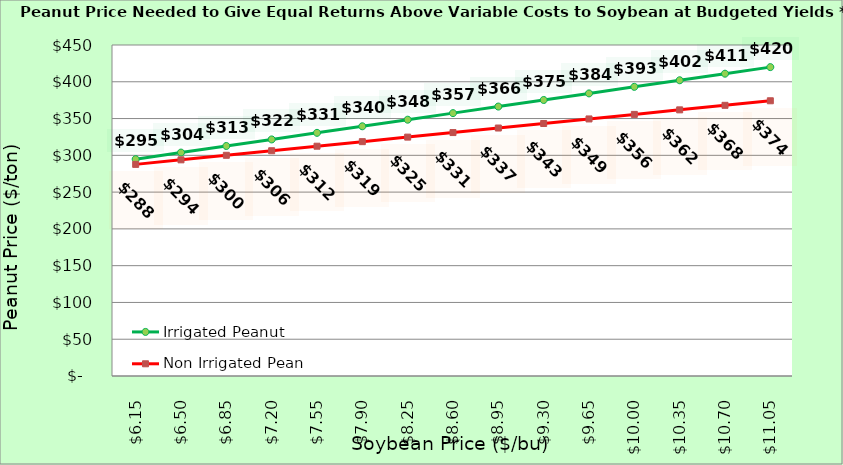
| Category | Irrigated Peanut | Non Irrigated Peanut |
|---|---|---|
| 6.150000000000002 | 294.823 | 287.707 |
| 6.500000000000002 | 303.759 | 293.883 |
| 6.850000000000001 | 312.695 | 300.06 |
| 7.200000000000001 | 321.632 | 306.236 |
| 7.550000000000001 | 330.568 | 312.413 |
| 7.9 | 339.504 | 318.589 |
| 8.25 | 348.44 | 324.766 |
| 8.6 | 357.376 | 330.942 |
| 8.95 | 366.312 | 337.119 |
| 9.299999999999999 | 375.249 | 343.295 |
| 9.649999999999999 | 384.185 | 349.471 |
| 9.999999999999998 | 393.121 | 355.648 |
| 10.349999999999998 | 402.057 | 361.824 |
| 10.699999999999998 | 410.993 | 368.001 |
| 11.049999999999997 | 419.929 | 374.177 |